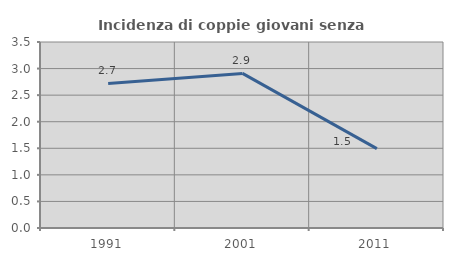
| Category | Incidenza di coppie giovani senza figli |
|---|---|
| 1991.0 | 2.721 |
| 2001.0 | 2.909 |
| 2011.0 | 1.493 |